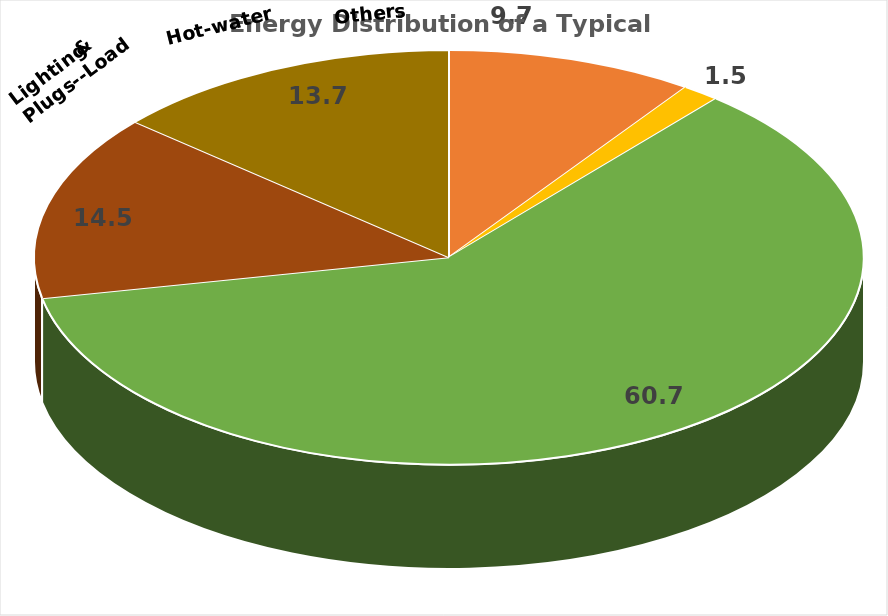
| Category |   |
|---|---|
| Power Station     | 9.663 |
| Power Station Insurance    | 1.464 |
| Electric Utility     | 60.719 |
| DC System Cost | 14.488 |
|   DC Running Cost | 13.665 |